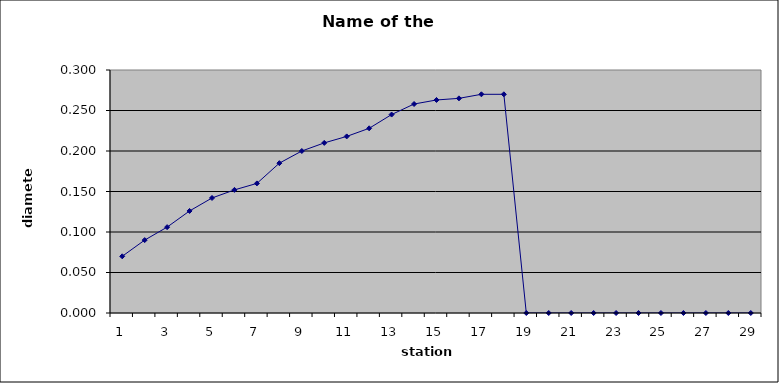
| Category | Series 0 |
|---|---|
| 0 | 0.07 |
| 1 | 0.09 |
| 2 | 0.106 |
| 3 | 0.126 |
| 4 | 0.142 |
| 5 | 0.152 |
| 6 | 0.16 |
| 7 | 0.185 |
| 8 | 0.2 |
| 9 | 0.21 |
| 10 | 0.218 |
| 11 | 0.228 |
| 12 | 0.245 |
| 13 | 0.258 |
| 14 | 0.263 |
| 15 | 0.265 |
| 16 | 0.27 |
| 17 | 0.27 |
| 18 | 0 |
| 19 | 0 |
| 20 | 0 |
| 21 | 0 |
| 22 | 0 |
| 23 | 0 |
| 24 | 0 |
| 25 | 0 |
| 26 | 0 |
| 27 | 0 |
| 28 | 0 |